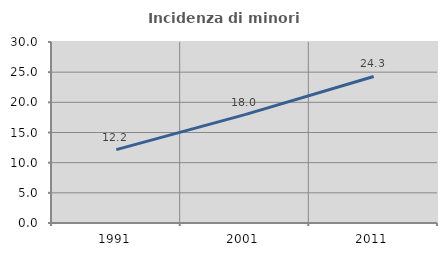
| Category | Incidenza di minori stranieri |
|---|---|
| 1991.0 | 12.167 |
| 2001.0 | 17.963 |
| 2011.0 | 24.284 |